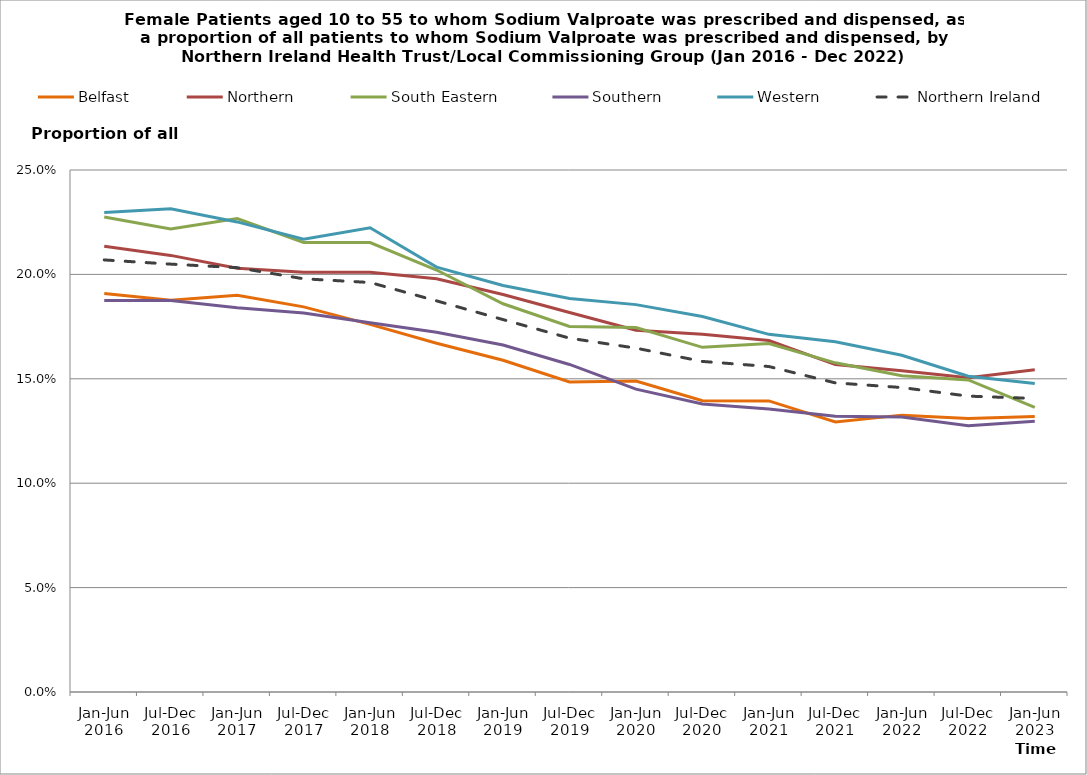
| Category | Belfast | Northern | South Eastern | Southern | Western | Northern Ireland |
|---|---|---|---|---|---|---|
| Jan-Jun 2016 | 0.191 | 0.213 | 0.228 | 0.188 | 0.23 | 0.207 |
| Jul-Dec 2016 | 0.188 | 0.209 | 0.222 | 0.188 | 0.231 | 0.205 |
| Jan-Jun 2017 | 0.19 | 0.203 | 0.227 | 0.184 | 0.225 | 0.203 |
| Jul-Dec 2017 | 0.184 | 0.201 | 0.215 | 0.182 | 0.217 | 0.198 |
| Jan-Jun 2018 | 0.176 | 0.201 | 0.215 | 0.177 | 0.222 | 0.196 |
| Jul-Dec 2018 | 0.167 | 0.198 | 0.202 | 0.172 | 0.203 | 0.187 |
| Jan-Jun 2019 | 0.159 | 0.19 | 0.186 | 0.166 | 0.195 | 0.178 |
| Jul-Dec 2019 | 0.148 | 0.182 | 0.175 | 0.157 | 0.188 | 0.169 |
| Jan-Jun 2020 | 0.149 | 0.173 | 0.175 | 0.145 | 0.186 | 0.165 |
| Jul-Dec 2020 | 0.139 | 0.171 | 0.165 | 0.138 | 0.18 | 0.158 |
| Jan-Jun 2021 | 0.139 | 0.168 | 0.167 | 0.136 | 0.171 | 0.156 |
| Jul-Dec 2021 | 0.129 | 0.157 | 0.158 | 0.132 | 0.168 | 0.148 |
| Jan-Jun 2022 | 0.133 | 0.154 | 0.151 | 0.132 | 0.161 | 0.146 |
| Jul-Dec 2022 | 0.131 | 0.151 | 0.149 | 0.127 | 0.151 | 0.142 |
| Jan-Jun 2023 | 0.132 | 0.154 | 0.136 | 0.13 | 0.148 | 0.141 |